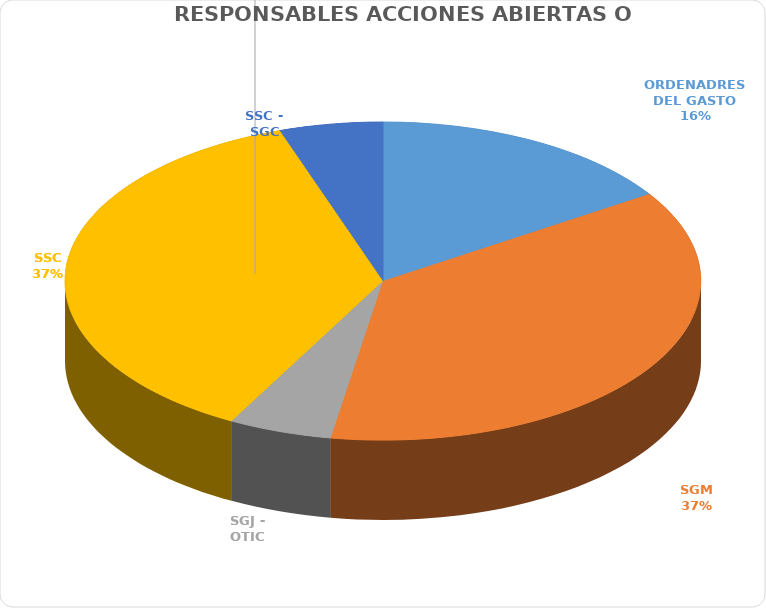
| Category | Series 0 |
|---|---|
| ORDENADRES DEL GASTO | 3 |
| SGM | 7 |
| SGJ - OTIC | 1 |
| SSC | 7 |
| SSC - SGC | 1 |